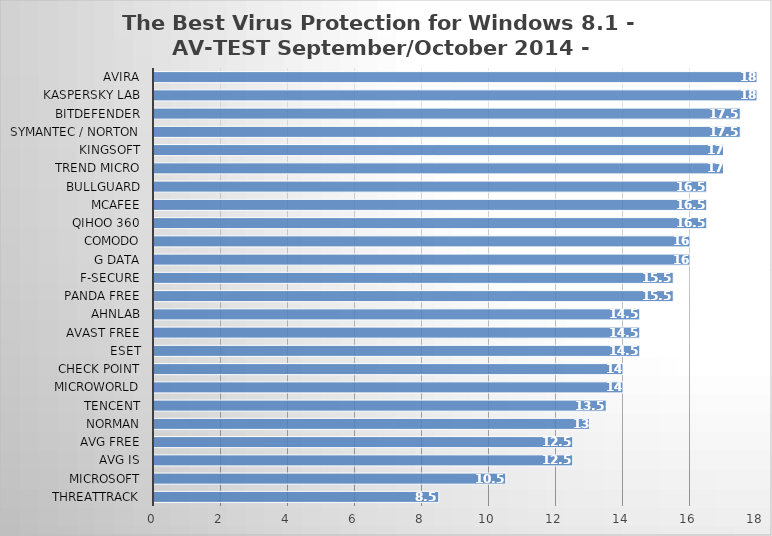
| Category | Series 0 |
|---|---|
| ThreatTrack | 8.5 |
| Microsoft | 10.5 |
| AVG IS | 12.5 |
| AVG Free | 12.5 |
| Norman | 13 |
| Tencent | 13.5 |
| Microworld | 14 |
| Check Point | 14 |
| ESET | 14.5 |
| Avast Free | 14.5 |
| AhnLab | 14.5 |
| Panda Free | 15.5 |
| F-Secure | 15.5 |
| G Data | 16 |
| Comodo | 16 |
| Qihoo 360 | 16.5 |
| McAfee | 16.5 |
| BullGuard | 16.5 |
| Trend Micro | 17 |
| Kingsoft | 17 |
| Symantec / Norton | 17.5 |
| Bitdefender | 17.5 |
| Kaspersky Lab | 18 |
| Avira | 18 |